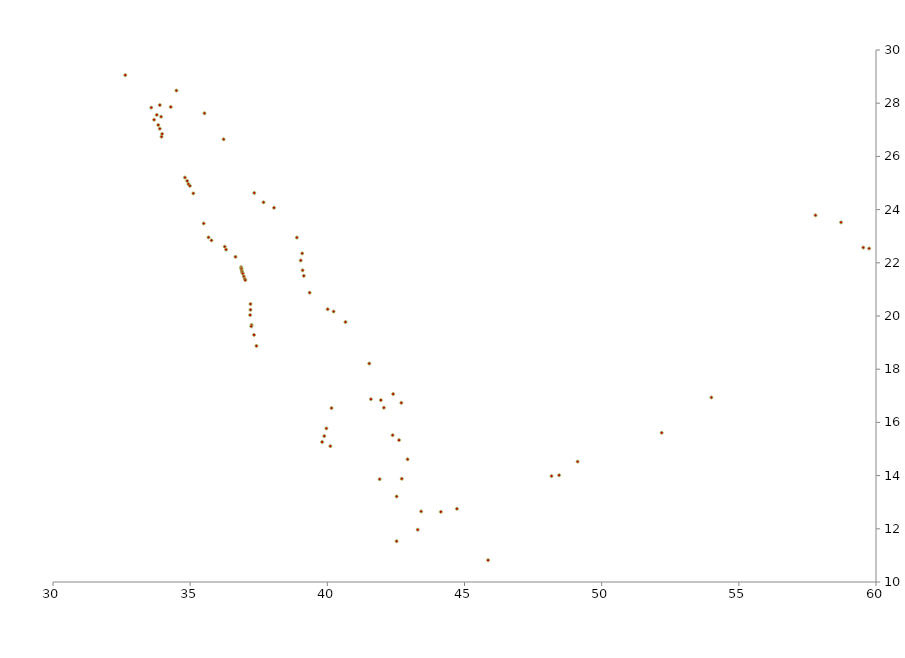
| Category | Red Sea PAH |
|---|---|
| 32.635191 | 29.055 |
| 33.893634 | 27.93 |
| 33.583485 | 27.834 |
| 33.782013 | 27.56 |
| 33.941979 | 27.493 |
| 33.685645 | 27.379 |
| 33.83795 | 27.181 |
| 33.893311 | 27.042 |
| 33.978515 | 26.845 |
| 33.956372 | 26.74 |
| 34.808958 | 25.205 |
| 34.892589 | 25.078 |
| 34.936523 | 24.962 |
| 34.990386 | 24.894 |
| 35.115423 | 24.609 |
| 35.493572 | 23.479 |
| 35.668514 | 22.956 |
| 35.777153 | 22.843 |
| 36.260299 | 22.608 |
| 36.30929 | 22.498 |
| 36.651959 | 22.225 |
| 36.859422 | 21.834 |
| 36.865975 | 21.79 |
| 36.871819 | 21.76 |
| 36.886603 | 21.687 |
| 36.895915 | 21.643 |
| 36.919704 | 21.595 |
| 36.954236 | 21.489 |
| 36.987013 | 21.402 |
| 37.010724 | 21.349 |
| 37.199426 | 20.45 |
| 37.198738 | 20.233 |
| 37.185976 | 20.035 |
| 37.238526 | 19.661 |
| 37.227475 | 19.609 |
| 37.328189 | 19.289 |
| 37.415795 | 18.875 |
| 40.153202 | 16.539 |
| 39.965538 | 15.774 |
| 39.811446 | 15.264 |
| 39.889168 | 15.486 |
| 40.110639 | 15.106 |
| 41.907061 | 13.865 |
| 42.526752 | 13.215 |
| 43.294719 | 11.966 |
| 42.523545 | 11.533 |
| 45.859682 | 10.82 |
| 34.499527 | 28.475 |
| 34.291968 | 27.859 |
| 35.520983 | 27.622 |
| 36.219316 | 26.643 |
| 37.337314 | 24.626 |
| 37.673649 | 24.274 |
| 38.057044 | 24.07 |
| 38.888721 | 22.949 |
| 39.084469 | 22.353 |
| 39.030927 | 22.088 |
| 39.098442 | 21.717 |
| 39.142121 | 21.511 |
| 39.354983 | 20.876 |
| 40.011822 | 20.255 |
| 40.229582 | 20.168 |
| 40.662476 | 19.773 |
| 41.528807 | 18.214 |
| 42.400691 | 17.068 |
| 41.587623 | 16.871 |
| 41.951117 | 16.837 |
| 42.698179 | 16.735 |
| 42.060748 | 16.553 |
| 42.378796 | 15.52 |
| 42.614084 | 15.334 |
| 42.925455 | 14.613 |
| 42.713688 | 13.881 |
| 43.42024 | 12.653 |
| 44.137997 | 12.638 |
| 44.724326 | 12.754 |
| 48.173209 | 13.983 |
| 48.448849 | 14.012 |
| 49.123511 | 14.526 |
| 52.186919 | 15.61 |
| 53.999393 | 16.937 |
| 59.749053 | 22.538 |
| 59.536214 | 22.573 |
| 58.72588 | 23.52 |
| 57.794247 | 23.786 |